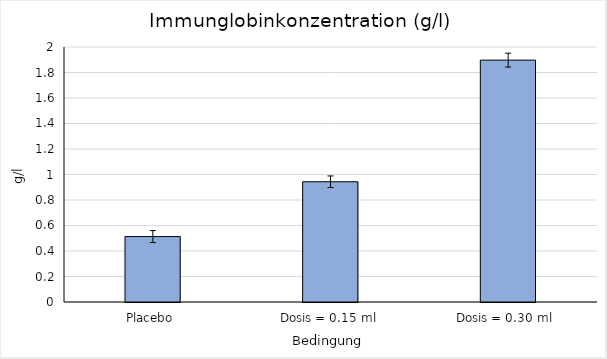
| Category | M  |
|---|---|
| Placebo  | 0.513 |
| Dosis = 0.15 ml | 0.943 |
| Dosis = 0.30 ml  | 1.897 |